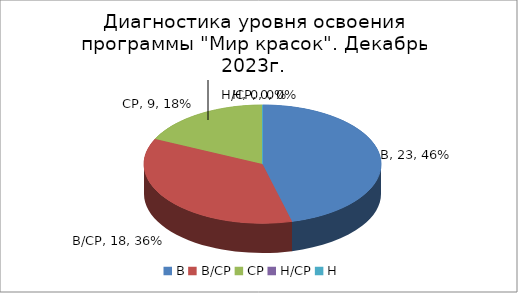
| Category | Декабрь 2023 |
|---|---|
| В | 23 |
| В/СР | 18 |
| СР | 9 |
| Н/СР | 0 |
| Н | 0 |